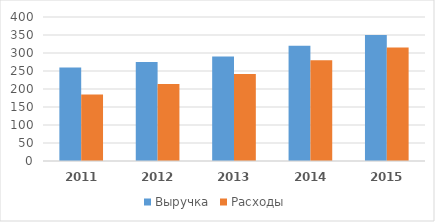
| Category | Выручка | Расходы |
|---|---|---|
| 2011.0 | 260 | 185 |
| 2012.0 | 275 | 214 |
| 2013.0 | 290 | 242 |
| 2014.0 | 320 | 280 |
| 2015.0 | 350 | 315 |